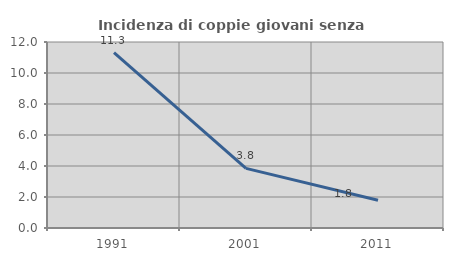
| Category | Incidenza di coppie giovani senza figli |
|---|---|
| 1991.0 | 11.321 |
| 2001.0 | 3.846 |
| 2011.0 | 1.786 |